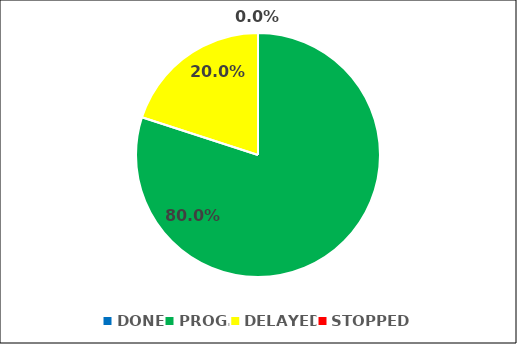
| Category | Series 0 |
|---|---|
| DONE | 0 |
| PROG. | 0.8 |
| DELAYED | 0.2 |
| STOPPED | 0 |